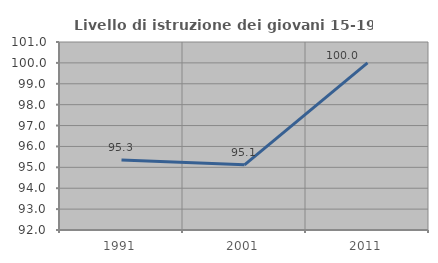
| Category | Livello di istruzione dei giovani 15-19 anni |
|---|---|
| 1991.0 | 95.349 |
| 2001.0 | 95.122 |
| 2011.0 | 100 |